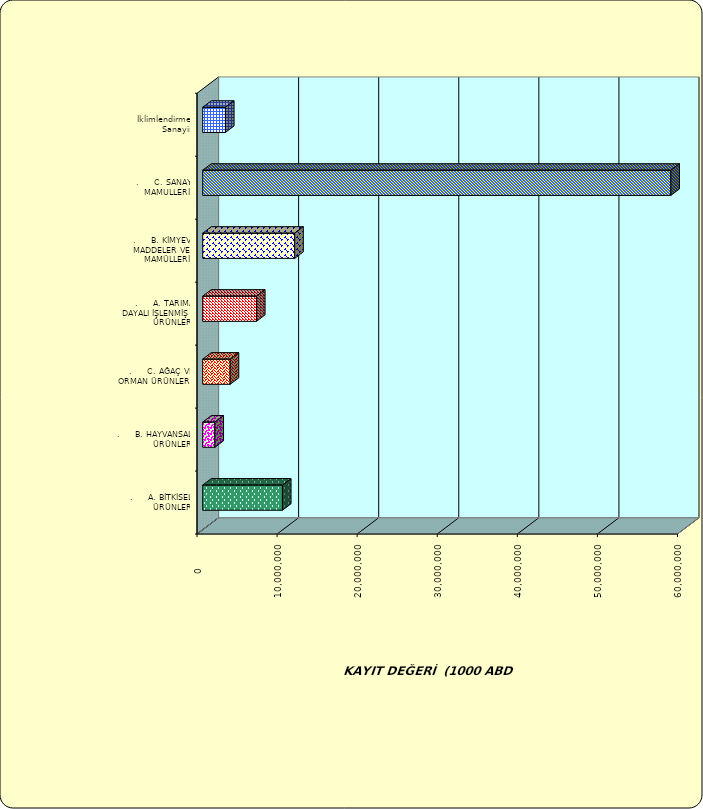
| Category | Series 0 |
|---|---|
| .     A. BİTKİSEL ÜRÜNLER | 9958228.694 |
| .     B. HAYVANSAL ÜRÜNLER | 1527414.461 |
| .     C. AĞAÇ VE ORMAN ÜRÜNLERİ | 3430096.584 |
| .     A. TARIMA DAYALI İŞLENMİŞ ÜRÜNLER | 6713691.654 |
| .     B. KİMYEVİ MADDELER VE MAMÜLLERİ | 11492274.51 |
| .     C. SANAYİ MAMULLERİ | 58462182.211 |
|  İklimlendirme Sanayii | 2841727.109 |